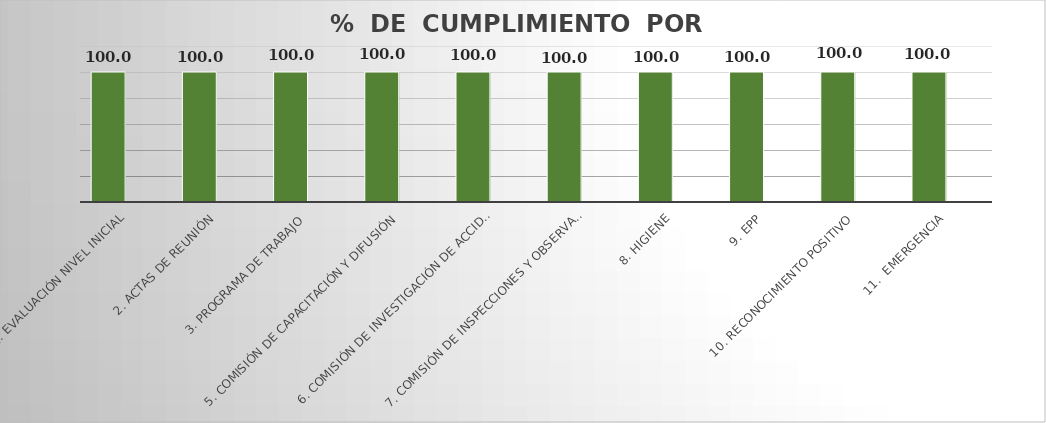
| Category | Series 0 | Series 1 |
|---|---|---|
| 1. EVALUACIÓN NIVEL INICIAL | 100 |  |
| 2. ACTAS DE REUNIÓN | 100 |  |
| 3. PROGRAMA DE TRABAJO | 100 |  |
| 5. COMISIÓN DE CAPACITACIÓN Y DIFUSIÓN | 100 |  |
| 6. COMISIÓN DE INVESTIGACIÓN DE ACCIDENTES | 100 |  |
| 7. COMISIÓN DE INSPECCIONES Y OBSERVACIONES | 100 |  |
| 8. HIGIENE | 100 |  |
| 9. EPP | 100 |  |
| 10. RECONOCIMIENTO POSITIVO | 100 |  |
| 11.  EMERGENCIA | 100 |  |